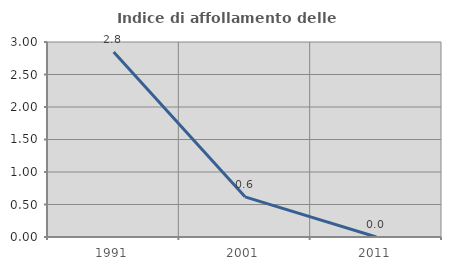
| Category | Indice di affollamento delle abitazioni  |
|---|---|
| 1991.0 | 2.848 |
| 2001.0 | 0.618 |
| 2011.0 | 0 |